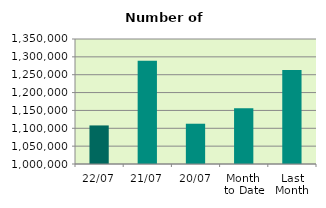
| Category | Series 0 |
|---|---|
| 22/07 | 1107982 |
| 21/07 | 1288816 |
| 20/07 | 1112758 |
| Month 
to Date | 1155989.5 |
| Last
Month | 1263143.455 |